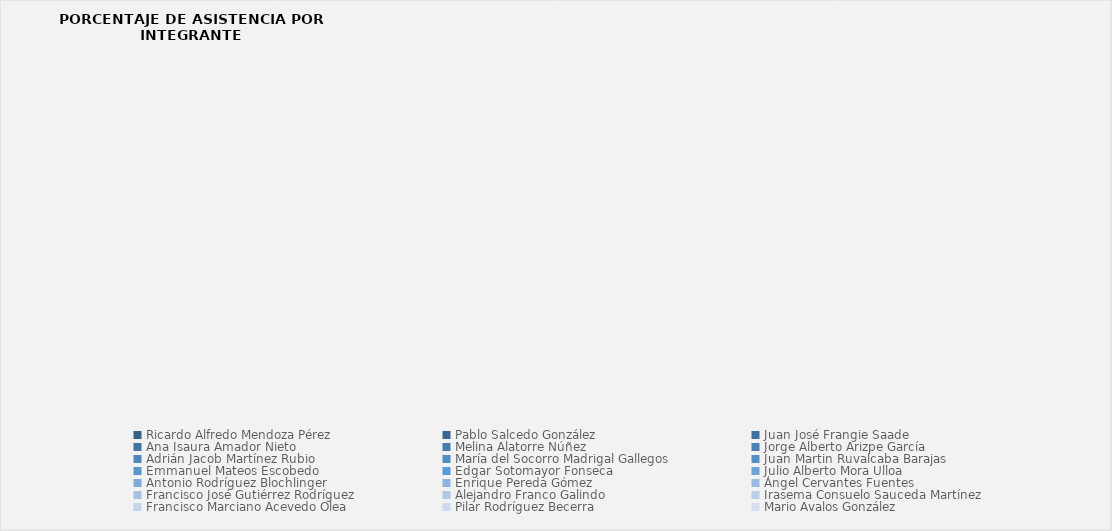
| Category | Series 0 |
|---|---|
| Ricardo Alfredo Mendoza Pérez | 0 |
| Pablo Salcedo González | 0 |
| Juan José Frangie Saade | 0 |
| Ana Isaura Amador Nieto | 0 |
| Melina Alatorre Núñez | 0 |
| Jorge Alberto Arizpe García | 0 |
| Adrián Jacob Martínez Rubio | 0 |
| María del Socorro Madrigal Gallegos | 0 |
| Juan Martin Ruvalcaba Barajas | 0 |
| Emmanuel Mateos Escobedo | 0 |
| Edgar Sotomayor Fonseca | 0 |
| Julio Alberto Mora Ulloa | 0 |
| Antonio Rodríguez Blochlinger | 0 |
| Enrique Pereda Gómez | 0 |
| Ángel Cervantes Fuentes | 0 |
| Francisco José Gutiérrez Rodríguez | 0 |
| Alejandro Franco Galindo | 0 |
| Irasema Consuelo Sauceda Martínez | 0 |
| Francisco Marciano Acevedo Olea | 0 |
| Pilar Rodríguez Becerra | 0 |
| Mario Avalos González | 0 |